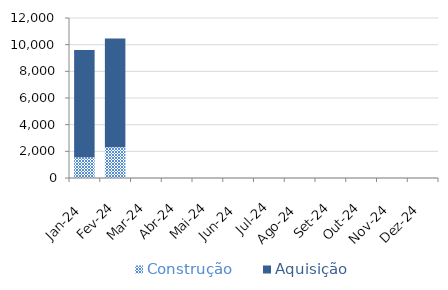
| Category | Construção | Aquisição  |
|---|---|---|
| Jan-24 | 1559.688 | 8046.6 |
| Fev-24 | 2314.838 | 8142.846 |
| Mar-24 | 0 | 0 |
| Abr-24 | 0 | 0 |
| Mai-24 | 0 | 0 |
| Jun-24 | 0 | 0 |
| Jul-24 | 0 | 0 |
| Ago-24 | 0 | 0 |
| Set-24 | 0 | 0 |
| Out-24 | 0 | 0 |
| Nov-24 | 0 | 0 |
| Dez-24 | 0 | 0 |